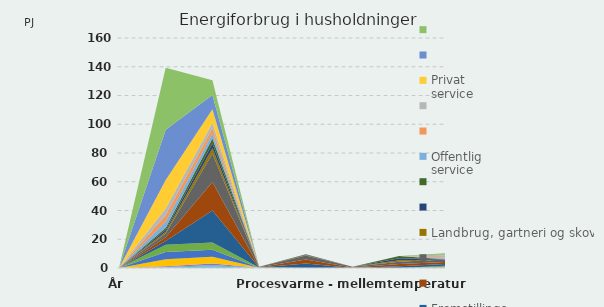
| Category | Bygge- og anlægs-
virksomhed | Series 1 | Series 2 | Detail- og 
engroshandel | Series 4 | Series 5 | Fremstillings-
virksomhed | Series 7 | Series 8 | Landbrug, gartneri og skovbrug | Series 10 | Series 11 | Offentlig 
service | Series 13 | Series 14 | Privat 
service | Series 16 | Series 17 |
|---|---|---|---|---|---|---|---|---|---|---|---|---|---|---|---|---|---|---|
| År | 0 | 0 | 0 | 0 | 0 | 0 | 0 | 0 | 0 | 0 | 0 | 0 | 0 | 0 | 0 | 0 | 0 | 0 |
| Belysning og elektronik | 0.4 | 0.37 | 0.38 | 4.91 | 4.99 | 5.04 | 2.74 | 2.52 | 2.58 | 1.37 | 1.31 | 1.31 | 4.27 | 4.54 | 4.69 | 19.72 | 35.12 | 43.05 |
| Elektriske motorer & ventilation/køling | 1.09 | 1 | 1.01 | 4.81 | 4.87 | 4.89 | 22.38 | 19.77 | 19.83 | 3.6 | 3.39 | 3.37 | 3.48 | 3.68 | 3.78 | 9.56 | 9.9 | 10.12 |
| Intern transport | 0.06 | 0.08 | 0.11 | 0 | 0.01 | 0.02 | 0.15 | 0.17 | 0.27 | 0 | 0.01 | 0.01 | 0 | 0.01 | 0.01 | 0 | 0.01 | 0.02 |
| Procesvarme - højtemperatur | 0 | 0 | 0 | 0 | 0 | 0 | 3.06 | 2.81 | 2.91 | 0.29 | 0.27 | 0.26 | 0 | 0 | 0 | 0 | 0 | 0 |
| Procesvarme - mellemtemperatur | 0 | 0 | 0 | 0 | 0 | 0 | 0.06 | 0.32 | 0.5 | 0 | 0 | 0 | 0 | 0 | 0 | 0 | 0 | 0 |
| Procesvarme - lavtemperatur | 0 | 0 | 0 | 0.01 | 0.02 | 0.04 | 1.12 | 1.56 | 1.63 | 1.07 | 1.32 | 1.51 | 0.01 | 0.01 | 0.01 | 0.01 | 0.03 | 0.05 |
| Rumvarme | 0.09 | 0.11 | 0.12 | 0.14 | 0.45 | 0.68 | 1.21 | 1.46 | 1.72 | 0.03 | 0.05 | 0.06 | 0.4 | 0.69 | 1.26 | 0.35 | 0.54 | 0.92 |